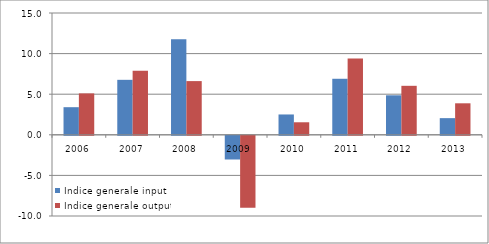
| Category | Indice generale input | Indice generale output |
|---|---|---|
| 2006.0 | 3.4 | 5.1 |
| 2007.0 | 6.77 | 7.897 |
| 2008.0 | 11.775 | 6.614 |
| 2009.0 | -2.917 | -8.85 |
| 2010.0 | 2.504 | 1.543 |
| 2011.0 | 6.9 | 9.4 |
| 2012.0 | 4.864 | 6.033 |
| 2013.0 | 2.052 | 3.879 |